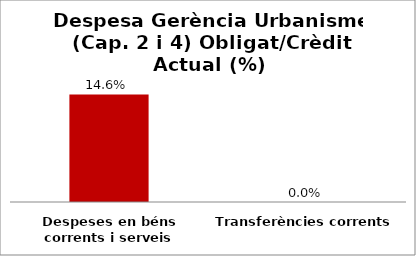
| Category | Series 0 |
|---|---|
| Despeses en béns corrents i serveis | 0.146 |
| Transferències corrents | 0 |